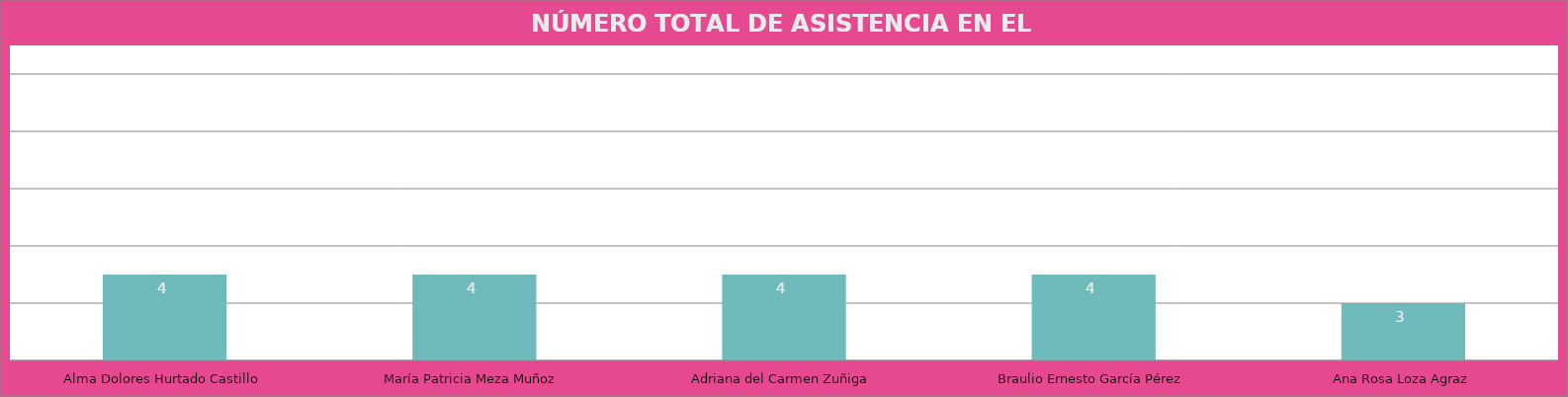
| Category | Alma Dolores Hurtado Castillo |
|---|---|
| Alma Dolores Hurtado Castillo | 4 |
| María Patricia Meza Muñoz | 4 |
| Adriana del Carmen Zuñiga | 4 |
| Braulio Ernesto García Pérez | 4 |
| Ana Rosa Loza Agraz | 3 |